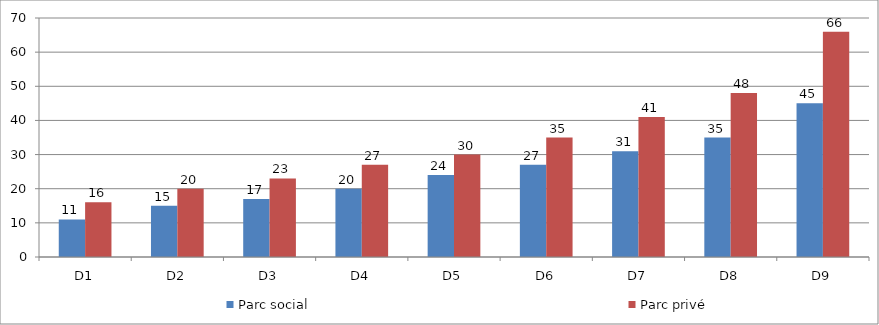
| Category | Parc social  | Parc privé  |
|---|---|---|
| D1 | 11 | 16 |
| D2 | 15 | 20 |
| D3 | 17 | 23 |
| D4 | 20 | 27 |
| D5 | 24 | 30 |
| D6 | 27 | 35 |
| D7 | 31 | 41 |
| D8 | 35 | 48 |
| D9 | 45 | 66 |